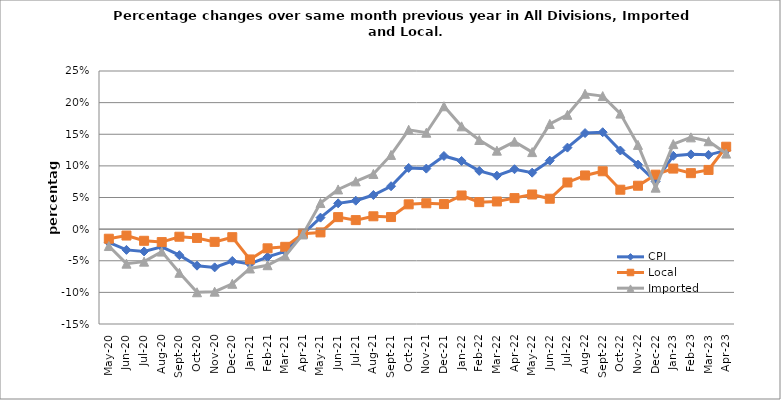
| Category | CPI | Local | Imported |
|---|---|---|---|
| 2020-05-01 | -0.021 | -0.015 | -0.027 |
| 2020-06-01 | -0.033 | -0.01 | -0.055 |
| 2020-07-01 | -0.035 | -0.018 | -0.051 |
| 2020-08-01 | -0.028 | -0.02 | -0.036 |
| 2020-09-01 | -0.041 | -0.012 | -0.069 |
| 2020-10-01 | -0.058 | -0.014 | -0.1 |
| 2020-11-01 | -0.06 | -0.02 | -0.099 |
| 2020-12-01 | -0.05 | -0.013 | -0.086 |
| 2021-01-01 | -0.055 | -0.048 | -0.062 |
| 2021-02-01 | -0.044 | -0.03 | -0.057 |
| 2021-03-01 | -0.035 | -0.028 | -0.043 |
| 2021-04-01 | -0.008 | -0.007 | -0.008 |
| 2021-05-01 | 0.018 | -0.005 | 0.041 |
| 2021-06-01 | 0.041 | 0.019 | 0.063 |
| 2021-07-01 | 0.045 | 0.014 | 0.075 |
| 2021-08-01 | 0.054 | 0.02 | 0.087 |
| 2021-09-01 | 0.068 | 0.019 | 0.117 |
| 2021-10-01 | 0.097 | 0.039 | 0.157 |
| 2021-11-01 | 0.096 | 0.041 | 0.152 |
| 2021-12-01 | 0.116 | 0.04 | 0.194 |
| 2022-01-01 | 0.108 | 0.053 | 0.163 |
| 2022-02-01 | 0.092 | 0.043 | 0.141 |
| 2022-03-01 | 0.085 | 0.044 | 0.124 |
| 2022-04-01 | 0.095 | 0.049 | 0.138 |
| 2022-05-01 | 0.089 | 0.055 | 0.122 |
| 2022-06-01 | 0.108 | 0.048 | 0.166 |
| 2022-07-01 | 0.129 | 0.074 | 0.181 |
| 2022-08-01 | 0.152 | 0.085 | 0.214 |
| 2022-09-01 | 0.153 | 0.091 | 0.21 |
| 2022-10-01 | 0.124 | 0.062 | 0.183 |
| 2022-11-01 | 0.102 | 0.069 | 0.133 |
| 2022-12-01 | 0.075 | 0.086 | 0.066 |
| 2023-01-01 | 0.116 | 0.096 | 0.134 |
| 2023-02-01 | 0.118 | 0.088 | 0.145 |
| 2023-03-01 | 0.117 | 0.094 | 0.139 |
| 2023-04-01 | 0.124 | 0.13 | 0.119 |